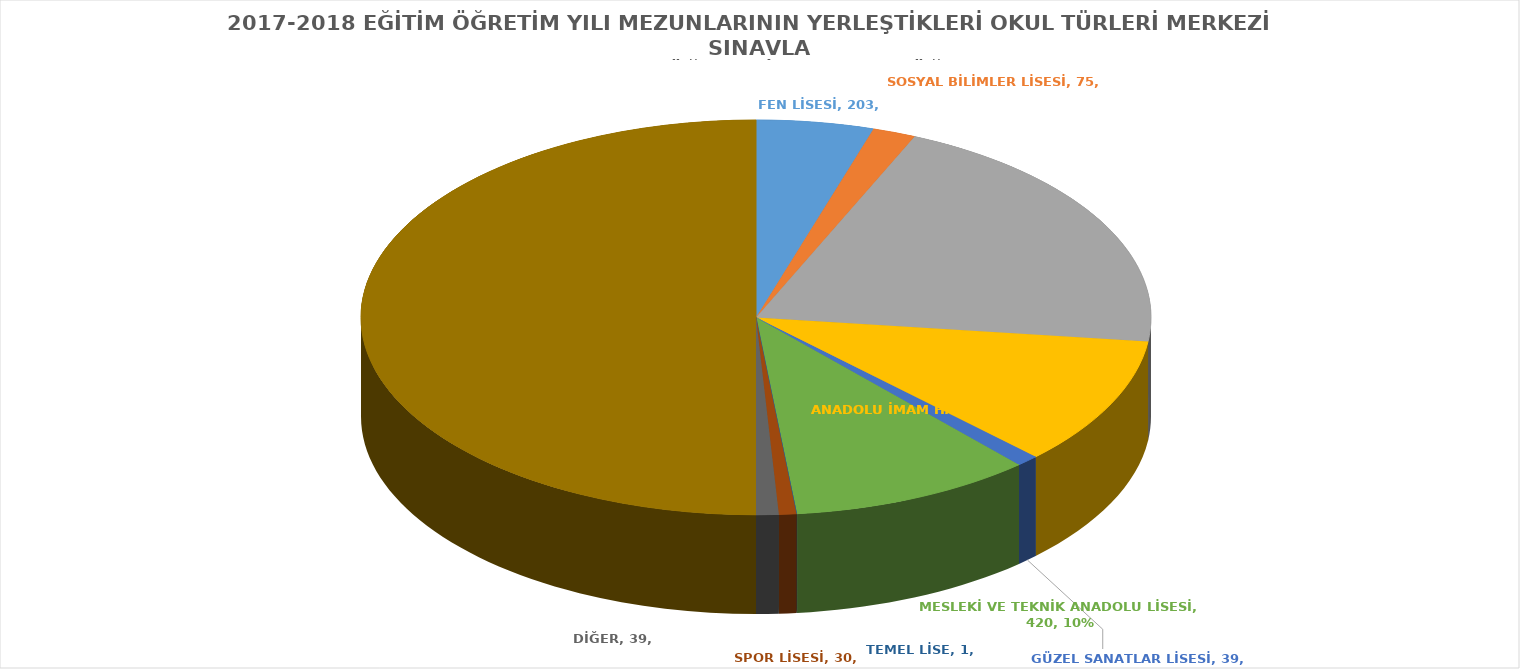
| Category | 2017-2018 EĞİTİM ÖĞRETİM YILI MEZUNLARININ YERLEŞTİKLERİ OKUL TÜRLERİ MERKEZİ SINAVLA
YERLEŞEN ÖĞRENCİ SAYISI KIZ ÖĞR. | 2017-2018 EĞİTİM ÖĞRETİM YILI MEZUNLARININ YERLEŞTİKLERİ OKUL TÜRLERİ MERKEZİ SINAVLA
YERLEŞEN ÖĞRENCİ SAYISI ERKEK ÖĞR. | 2017-2018 EĞİTİM ÖĞRETİM YILI MEZUNLARININ YERLEŞTİKLERİ OKUL TÜRLERİ ADRES KAYIT BÖLGESİNE GÖRE YERLEŞEN ÖĞRENCİ SAYISI KIZ ÖĞR. | 2017-2018 EĞİTİM ÖĞRETİM YILI MEZUNLARININ YERLEŞTİKLERİ OKUL TÜRLERİ ADRES KAYIT BÖLGESİNE GÖRE YERLEŞEN ÖĞRENCİ SAYISI ERKEK ÖĞR. | 2017-2018 EĞİTİM ÖĞRETİM YILI MEZUNLARININ YERLEŞTİKLERİ OKUL TÜRLERİ ÖZEL OKULA 
YERLEŞEN ÖĞRENCİ SAYISI KIZ ÖĞR. | 2017-2018 EĞİTİM ÖĞRETİM YILI MEZUNLARININ YERLEŞTİKLERİ OKUL TÜRLERİ ÖZEL OKULA 
YERLEŞEN ÖĞRENCİ SAYISI ERKEK ÖĞR. | 2017-2018 EĞİTİM ÖĞRETİM YILI MEZUNLARININ YERLEŞTİKLERİ OKUL TÜRLERİ TOPLAM ÖĞRENCİ SAYISI KIZ ÖĞR. | 2017-2018 EĞİTİM ÖĞRETİM YILI MEZUNLARININ YERLEŞTİKLERİ OKUL TÜRLERİ TOPLAM ÖĞRENCİ SAYISI ERKEK ÖĞR. | 2017-2018 EĞİTİM ÖĞRETİM YILI MEZUNLARININ YERLEŞTİKLERİ OKUL TÜRLERİ TOPLAM ÖĞRENCİ SAYISI GENEL |
|---|---|---|---|---|---|---|---|---|---|
| FEN LİSESİ | 203 | 246 | 143 | 160 | 117 | 112 | 463 | 518 | 981 |
| SOSYAL BİLİMLER LİSESİ | 75 | 58 | 1 | 0 | 0 | 0 | 76 | 58 | 134 |
| ANADOLU LİSESİ | 861 | 726 | 6719 | 5748 | 656 | 756 | 8236 | 7230 | 15466 |
| ANADOLU İMAM HATİP LİSESİ | 445 | 317 | 1609 | 1181 | 5 | 0 | 2059 | 1498 | 3557 |
| GÜZEL SANATLAR LİSESİ | 39 | 17 | 14 | 29 | 18 | 11 | 71 | 57 | 128 |
| MESLEKİ VE TEKNİK ANADOLU LİSESİ | 420 | 847 | 3317 | 5224 | 168 | 209 | 3905 | 6280 | 10185 |
| TEMEL LİSE | 1 | 6 | 15 | 20 | 55 | 56 | 71 | 82 | 153 |
| SPOR LİSESİ | 30 | 92 | 17 | 38 | 0 | 1 | 47 | 131 | 178 |
| DİĞER | 39 | 31 | 277 | 321 | 14 | 23 | 330 | 375 | 705 |
| TOPLAM | 2113 | 2340 | 12112 | 12721 | 1033 | 1168 | 15258 | 16229 | 31487 |